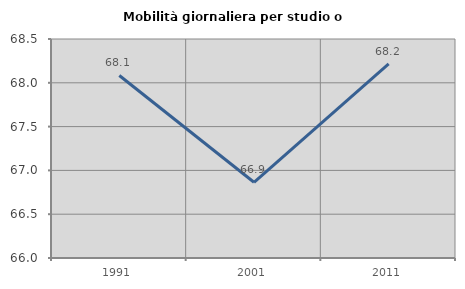
| Category | Mobilità giornaliera per studio o lavoro |
|---|---|
| 1991.0 | 68.084 |
| 2001.0 | 66.865 |
| 2011.0 | 68.215 |